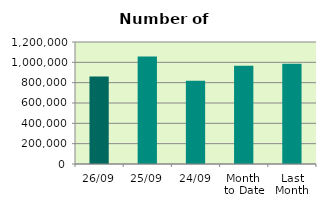
| Category | Series 0 |
|---|---|
| 26/09 | 860476 |
| 25/09 | 1057608 |
| 24/09 | 819112 |
| Month 
to Date | 966640.211 |
| Last
Month | 986270.455 |